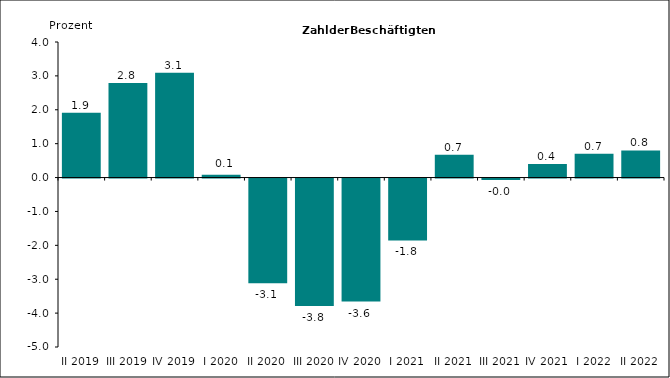
| Category | Series 0 |
|---|---|
| II 2019 | 1.91 |
| III 2019 | 2.793 |
| IV 2019 | 3.093 |
| I 2020 | 0.085 |
| II 2020 | -3.091 |
| III 2020 | -3.759 |
| IV 2020 | -3.628 |
| I 2021 | -1.825 |
| II 2021 | 0.67 |
| III 2021 | -0.044 |
| IV 2021 | 0.4 |
| I 2022 | 0.7 |
| II 2022 | 0.8 |